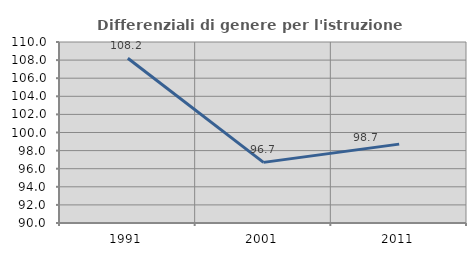
| Category | Differenziali di genere per l'istruzione superiore |
|---|---|
| 1991.0 | 108.206 |
| 2001.0 | 96.699 |
| 2011.0 | 98.716 |